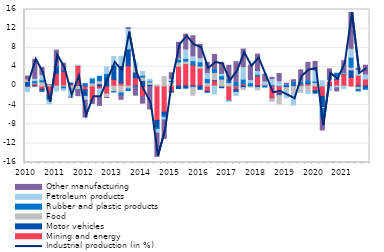
| Category | Mining and energy | Motor vehicles | Food  | Rubber and plastic products | Petroleum products | Other manufacturing |
|---|---|---|---|---|---|---|
| 2010 | -0.248 | 0.945 | 0.274 | -0.044 | -0.918 | 0.842 |
| II | 0.544 | -0.005 | 0.123 | 0.444 | 0.281 | 4.19 |
| III | -0.651 | -0.452 | 0.873 | 0.423 | 0.867 | 1.718 |
| IV | -1.98 | -0.567 | 0.135 | -0.462 | -0.713 | 0.166 |
| 2011 | 2.638 | 1.179 | -0.154 | 0.257 | -0.906 | 3.421 |
| II | 3.098 | 0.125 | -0.232 | -0.357 | -0.369 | 1.537 |
| III | 0.39 | 0.224 | -0.676 | -0.033 | -1.607 | -0.231 |
| IV | 4.306 | -0.098 | -0.671 | -0.138 | 0.009 | -1.33 |
| 2012 | -0.807 | -1.366 | -0.068 | 0.501 | -0.734 | -3.73 |
| II | -2.99 | -0.036 | 0.622 | 0.973 | 0.015 | -0.833 |
| III | -0.598 | 0.473 | 0.605 | 0.948 | -1.69 | -1.976 |
| IV | -1.686 | 1.82 | -0.709 | 0.774 | 1.43 | -0.219 |
| 2013 | 1.387 | 2.988 | -1.171 | -0.072 | 1.806 | -0.039 |
| II | 0.676 | 3.614 | -1.461 | -0.522 | 1.918 | -1.008 |
| III | 4.247 | 3.522 | -0.613 | -0.326 | 3.996 | 0.438 |
| IV | 1.699 | 1.24 | 1.077 | -0.344 | 0.887 | -1.58 |
| 2014 | -2.158 | 1.145 | 0.711 | 0.374 | 0.825 | -1.65 |
| II | -0.117 | 0.352 | 0.505 | 0.206 | 0.356 | -4.913 |
| III | -7.196 | -1.556 | 0.248 | -0.322 | -0.778 | -5.071 |
| IV | -5.482 | -0.701 | 1.976 | -0.383 | -0.54 | -4.041 |
| 2015 | -1.16 | -0.127 | 0.946 | 0.2 | 0.205 | 1.426 |
| II | 4.118 | -0.523 | 0.906 | 0.614 | 0.052 | 3.453 |
| III | 4.684 | -0.448 | 0.536 | 0.527 | 1.77 | 3.333 |
| IV | 4.383 | -0.269 | -1.617 | 0.885 | 0.812 | 4.418 |
| 2016 | 3.713 | -0.69 | 0.463 | 0.854 | 0.644 | 3.048 |
| II | -1.146 | -0.157 | 0.691 | 0.854 | 1.023 | 2.38 |
| III | 1.203 | 0.131 | 1.504 | 0.626 | -1.665 | 3.137 |
| IV | -0.136 | -0.235 | 1.435 | 0.709 | 0.289 | 2.52 |
| 2017 | -3.018 | -0.057 | 0.695 | 0.724 | -0.175 | 2.912 |
| II | -0.711 | -0.598 | 0.034 | 0.705 | -0.657 | 4.345 |
| III | 0.471 | -0.354 | -0.396 | 0.956 | 2.373 | 3.925 |
| IV | -0.06 | 0.021 | -0.152 | 0.648 | 0.446 | 3.245 |
| 2018 | 2.107 | -0.337 | -0.466 | 0.365 | 0.478 | 3.717 |
| II | 0.306 | 0.016 | -0.041 | -0.191 | 0.493 | 1.66 |
| III | -2.648 | -0.033 | -0.528 | 0.243 | 1.122 | 0.451 |
| IV | -1.596 | -0.365 | -1.784 | 0.055 | 0.793 | 1.75 |
| 2019 | -0.083 | -0.248 | -0.643 | 0.253 | -1.505 | 0.337 |
| II | 0.19 | -0.134 | -1.476 | 0.548 | -2.365 | 0.575 |
| III | 0.405 | -0.049 | -1.196 | 0.41 | -0.092 | 2.569 |
| IV | 0.469 | 0.228 | -1.239 | 0.433 | -0.36 | 3.822 |
| 2020 | -1.009 | -0.48 | 0.709 | 0.313 | 2.052 | 2.048 |
| II | -2.206 | -2.299 | -0.233 | -1.816 | 1.108 | -2.862 |
| III | 0.937 | -0.112 | 0.487 | 0.1 | -0.843 | 2.063 |
| IV | 1.429 | 0.25 | 0.503 | 0.489 | -0.36 | -0.87 |
| 2021 | 2.533 | 0.046 | 0.172 | 0.015 | -0.526 | 2.527 |
| II | 1.827 | 1.526 | 0.588 | 2.079 | 1.641 | 7.712 |
| III | 2.231 | -0.252 | -0.468 | -0.324 | 0.996 | 0.49 |
| IV | 1.506 | -0.414 | 0.013 | -0.276 | 0.761 | 2.056 |